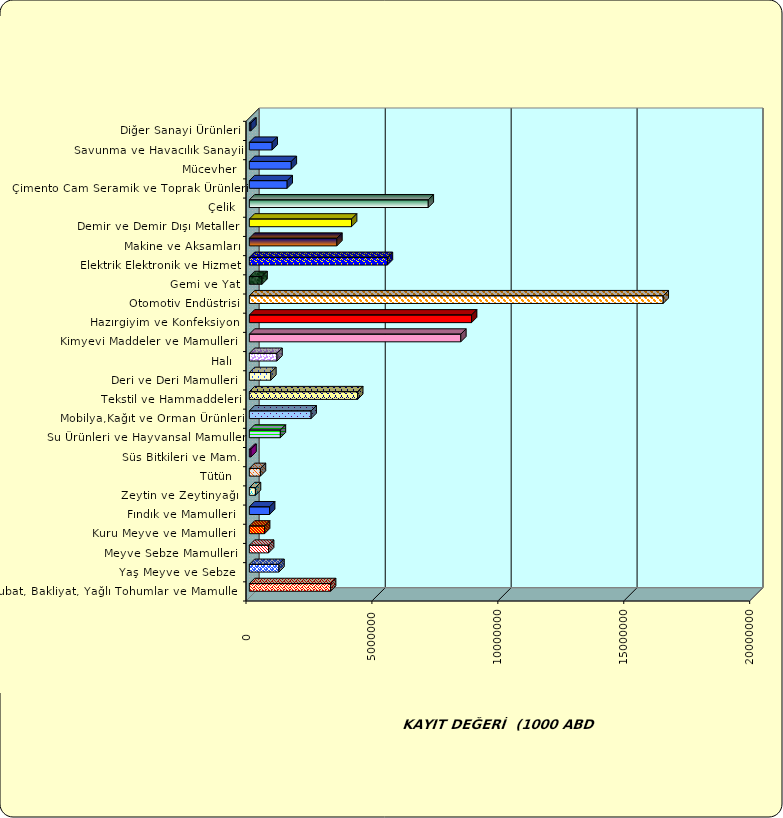
| Category | Series 0 |
|---|---|
|  Hububat, Bakliyat, Yağlı Tohumlar ve Mamulleri  | 3224916.849 |
|  Yaş Meyve ve Sebze   | 1175565.319 |
|  Meyve Sebze Mamulleri  | 764015.595 |
|  Kuru Meyve ve Mamulleri   | 605646.364 |
|  Fındık ve Mamulleri  | 803937.071 |
|  Zeytin ve Zeytinyağı  | 242243.865 |
|  Tütün  | 439522.364 |
|  Süs Bitkileri ve Mam. | 65104.963 |
|  Su Ürünleri ve Hayvansal Mamuller | 1231675.564 |
|  Mobilya,Kağıt ve Orman Ürünleri | 2452943.299 |
|  Tekstil ve Hammaddeleri | 4301640.028 |
|  Deri ve Deri Mamulleri  | 852800.662 |
|  Halı  | 1097656.339 |
|  Kimyevi Maddeler ve Mamulleri   | 8396826.213 |
|  Hazırgiyim ve Konfeksiyon  | 8823731.248 |
|  Otomotiv Endüstrisi | 16434420.672 |
|  Gemi ve Yat | 503559.602 |
|  Elektrik Elektronik ve Hizmet | 5481436.743 |
|  Makine ve Aksamları | 3475560.491 |
|  Demir ve Demir Dışı Metaller  | 4058346.177 |
|  Çelik | 7104863.567 |
|  Çimento Cam Seramik ve Toprak Ürünleri | 1502059.49 |
|  Mücevher | 1665371.878 |
|  Savunma ve Havacılık Sanayii | 906407.581 |
|  Diğer Sanayi Ürünleri | 61724.378 |